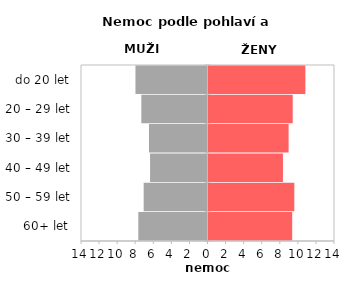
| Category | Nemoc |
|---|---|
| 60+ let | 9.262 |
| 50 – 59 let | 9.498 |
| 40 – 49 let | 8.239 |
| 30 – 39 let | 8.866 |
| 20 – 29 let | 9.32 |
| do 20 let | 10.72 |